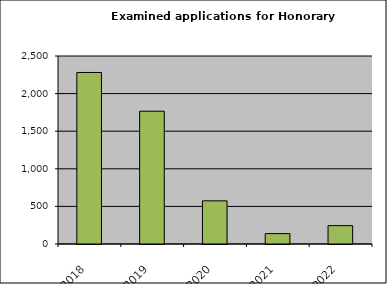
| Category | Series 1 |
|---|---|
| 2018.0 | 2281 |
| 2019.0 | 1766 |
| 2020.0 | 574 |
| 2021.0 | 138 |
| 2022.0 | 244 |